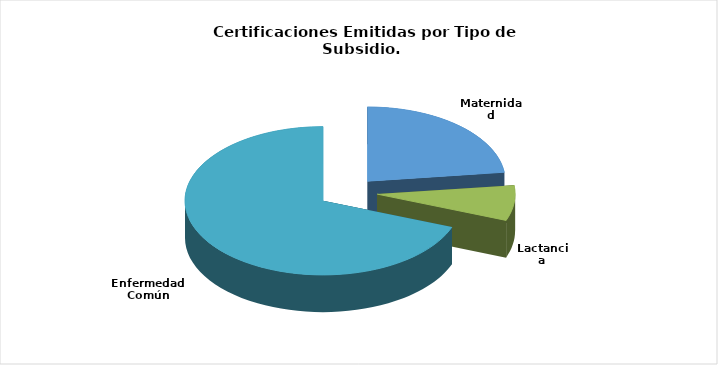
| Category | Total |
|---|---|
| Maternidad | 3 |
| Lactancia | 1 |
| Enfermedad Común | 9 |